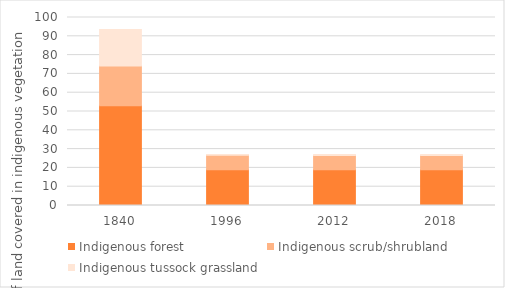
| Category | Indigenous forest | Indigenous scrub/shrubland | Indigenous tussock grassland |
|---|---|---|---|
| 1840.0 | 53.051 | 21.141 | 19.407 |
| 1996.0 | 19.011 | 7.663 | 0.474 |
| 2012.0 | 18.993 | 7.624 | 0.474 |
| 2018.0 | 18.989 | 7.611 | 0.476 |